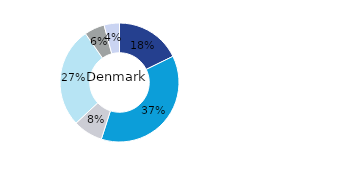
| Category | Denmark |
|---|---|
| Office | 0.178 |
| Residential | 0.372 |
| Retail | 0.081 |
| Logistics* | 0.273 |
| Public Sector | 0.055 |
| Other | 0.042 |